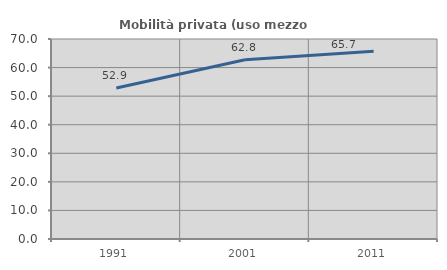
| Category | Mobilità privata (uso mezzo privato) |
|---|---|
| 1991.0 | 52.866 |
| 2001.0 | 62.764 |
| 2011.0 | 65.722 |